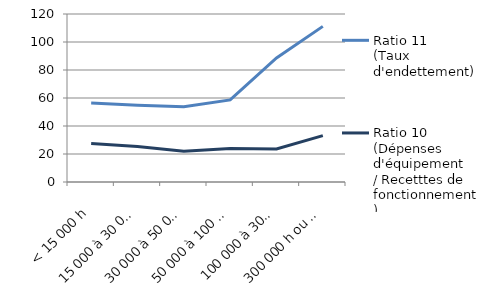
| Category | Ratio 11
(Taux d'endettement) | Ratio 10 
(Dépenses d'équipement
/ Recetttes de fonctionnement) |
|---|---|---|
| < 15 000 h | 56.429 | 27.503 |
| 15 000 à 30 000 h | 54.798 | 25.304 |
| 30 000 à 50 000 h | 53.763 | 22.029 |
| 50 000 à 100 000 h | 58.655 | 23.954 |
| 100 000 à 300 000 h | 88.605 | 23.65 |
| 300 000 h ou plus | 111.158 | 33.16 |